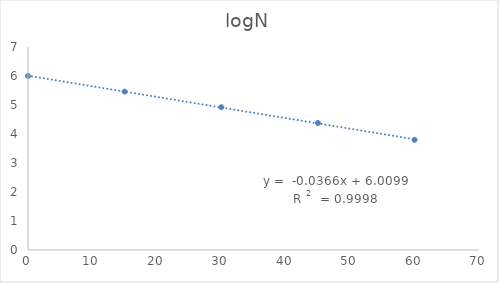
| Category | logN |
|---|---|
| 0.0 | 6 |
| 15.0 | 5.462 |
| 30.0 | 4.924 |
| 45.0 | 4.38 |
| 60.0 | 3.799 |